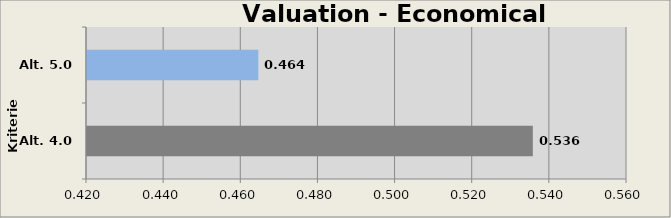
| Category | Valuation Economical Module  |
|---|---|
| Alt. 4.0 m | 0.536 |
| Alt. 5.0 m | 0.464 |